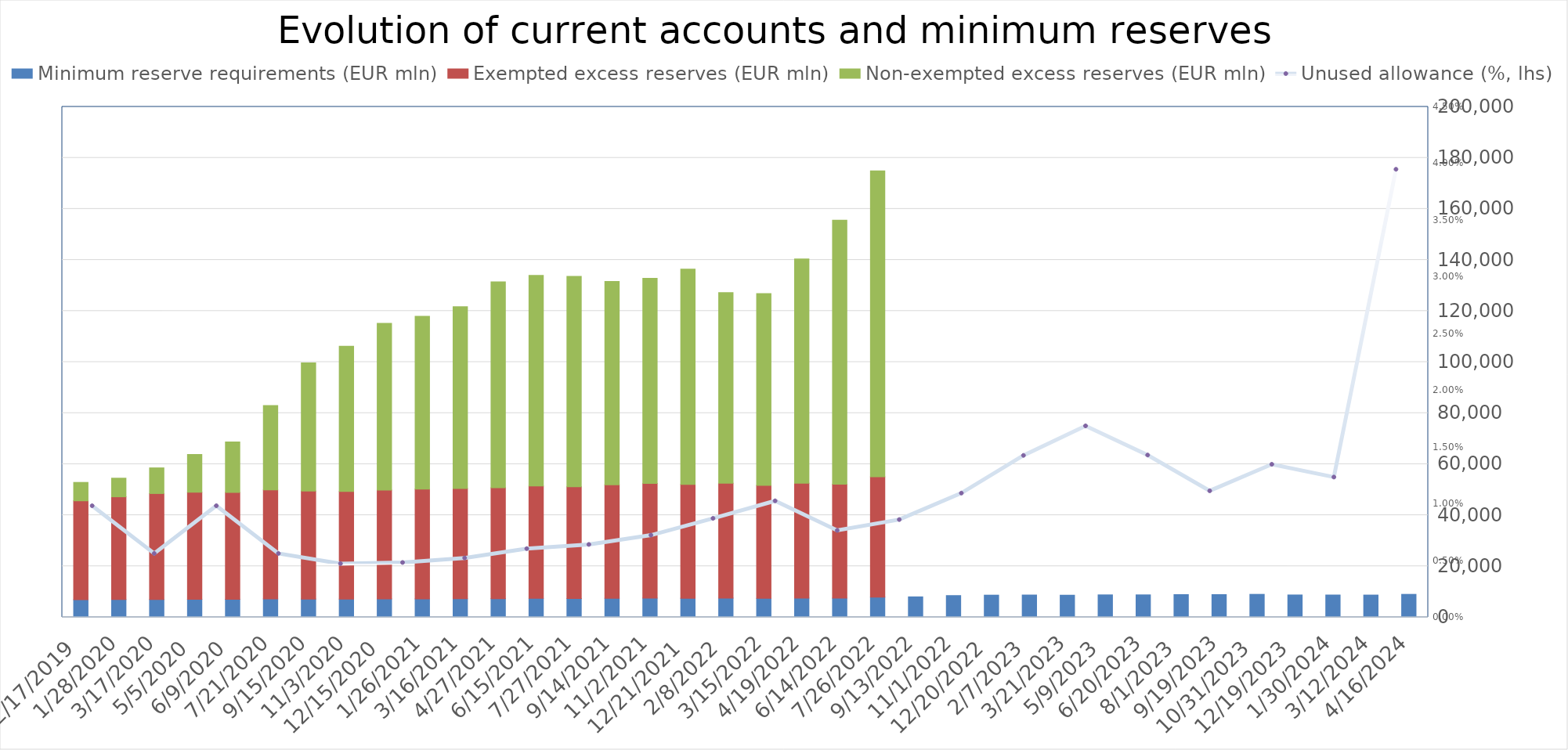
| Category | Minimum reserve requirements (EUR mln) | Exempted excess reserves (EUR mln) | Non-exempted excess reserves (EUR mln) |
|---|---|---|---|
| 4/16/24 | 8997 | 0 | 0 |
| 3/12/24 | 8722 | 0 | 0 |
| 1/30/24 | 8741.019 | 0 | 0 |
| 12/19/23 | 8762 | 0 | 0 |
| 10/31/23 | 9001 | 0 | 0 |
| 9/19/23 | 8896 | 0 | 0 |
| 8/1/23 | 8904 | 0 | 0 |
| 6/20/23 | 8799 | 0 | 0 |
| 5/9/23 | 8796 | 0 | 0 |
| 3/21/23 | 8668 | 0 | 0 |
| 2/7/23 | 8736 | 0 | 0 |
| 12/20/22 | 8689 | 0 | 0 |
| 11/1/22 | 8517 | 0 | 0 |
| 9/13/22 | 8018 | 0 | 0 |
| 7/26/22 | 7929 | 47109 | 119909 |
| 6/14/22 | 7495 | 44621 | 103454 |
| 4/19/22 | 7536 | 44962 | 87885 |
| 3/15/22 | 7409 | 44244 | 75192 |
| 2/8/22 | 7536 | 44997 | 74696 |
| 12/21/21 | 7472 | 44599 | 84381 |
| 11/2/21 | 7531 | 44914 | 80355 |
| 9/14/21 | 7460 | 44471 | 79647 |
| 7/27/21 | 7352 | 43793 | 82435 |
| 6/15/21 | 7404 | 44036 | 82520 |
| 4/27/21 | 7313 | 43430 | 80697 |
| 3/16/21 | 7254 | 43192 | 71224 |
| 1/26/21 | 7225 | 42978 | 67723 |
| 12/15/20 | 7190 | 42671 | 65344 |
| 11/3/20 | 7128 | 42161 | 56951 |
| 9/15/20 | 7165 | 42265 | 50289 |
| 7/21/20 | 7217 | 42685 | 33099 |
| 6/9/20 | 7060 | 41891 | 19741 |
| 5/5/20 | 7085 | 41937 | 14783 |
| 3/17/20 | 7002 | 41491 | 10061 |
| 1/28/20 | 6981 | 40234 | 7303 |
| 12/17/19 | 6887 | 38752 | 7220 |